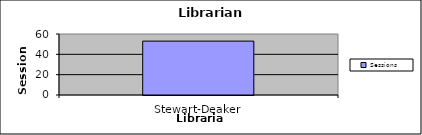
| Category | Sessions |
|---|---|
| Stewart-Deaker | 53 |